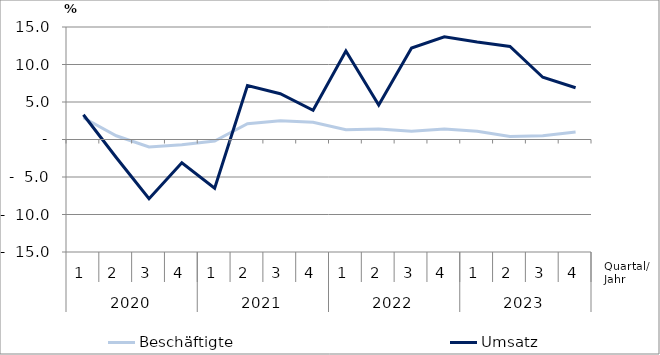
| Category | Beschäftigte | Umsatz |
|---|---|---|
| 0 | 2.9 | 3.3 |
| 1 | 0.5 | -2.4 |
| 2 | -1 | -7.9 |
| 3 | -0.7 | -3.1 |
| 4 | -0.2 | -6.5 |
| 5 | 2.1 | 7.2 |
| 6 | 2.5 | 6.1 |
| 7 | 2.3 | 3.9 |
| 8 | 1.3 | 11.8 |
| 9 | 1.4 | 4.6 |
| 10 | 1.1 | 12.2 |
| 11 | 1.4 | 13.7 |
| 12 | 1.1 | 13 |
| 13 | 0.4 | 12.4 |
| 14 | 0.5 | 8.3 |
| 15 | 1 | 6.9 |